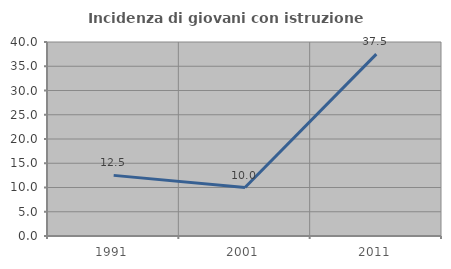
| Category | Incidenza di giovani con istruzione universitaria |
|---|---|
| 1991.0 | 12.5 |
| 2001.0 | 10 |
| 2011.0 | 37.5 |